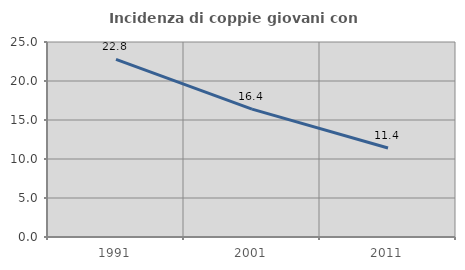
| Category | Incidenza di coppie giovani con figli |
|---|---|
| 1991.0 | 22.761 |
| 2001.0 | 16.389 |
| 2011.0 | 11.404 |